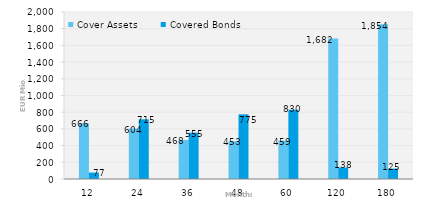
| Category | Cover Assets | Covered Bonds |
|---|---|---|
| 12.0 | 666.361 | 76.656 |
| 24.0 | 604.334 | 715 |
| 36.0 | 467.886 | 555 |
| 48.0 | 452.546 | 775 |
| 60.0 | 459.44 | 830 |
| 120.0 | 1682.414 | 138 |
| 180.0 | 1854.053 | 125 |